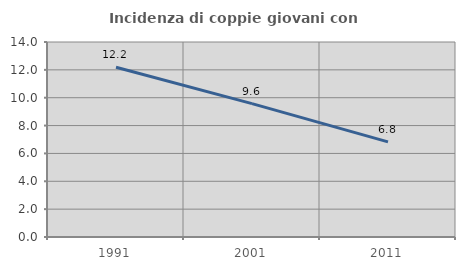
| Category | Incidenza di coppie giovani con figli |
|---|---|
| 1991.0 | 12.191 |
| 2001.0 | 9.577 |
| 2011.0 | 6.831 |